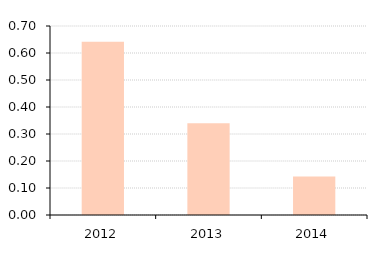
| Category | Debt to Equity Ratio |
|---|---|
| 2012.0 | 0.642 |
| 2013.0 | 0.34 |
| 2014.0 | 0.142 |